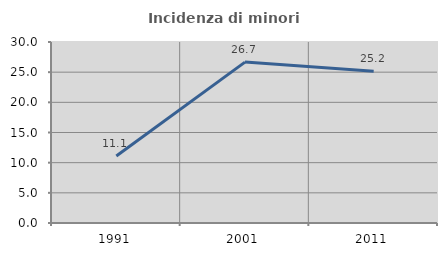
| Category | Incidenza di minori stranieri |
|---|---|
| 1991.0 | 11.111 |
| 2001.0 | 26.667 |
| 2011.0 | 25.161 |